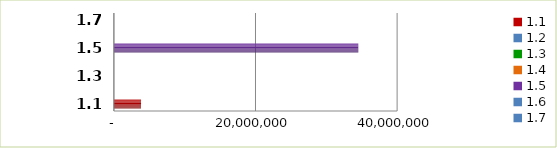
| Category | Series 0 |
|---|---|
| 1.1 | 3835150 |
| 1.2 | 0 |
| 1.3 | 0 |
| 1.4 | 0 |
| 1.5 | 34517923 |
| 1.6 | 4800 |
| 1.7 | 0 |